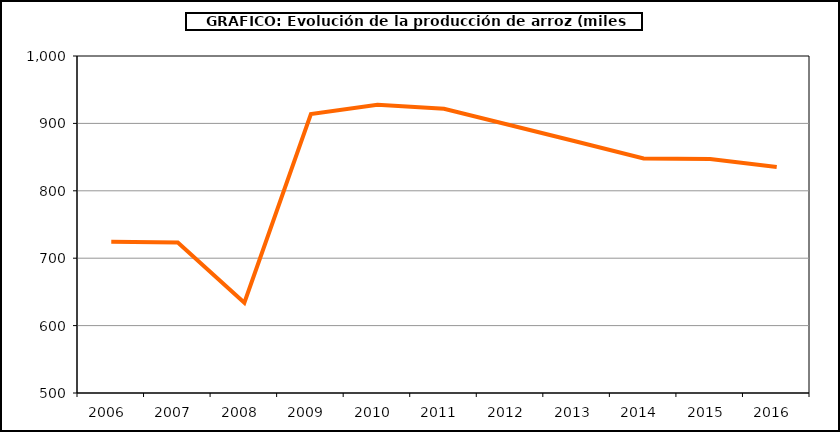
| Category | Superficie |
|---|---|
| 2006.0 | 724.351 |
| 2007.0 | 723.426 |
| 2008.0 | 633.987 |
| 2009.0 | 913.754 |
| 2010.0 | 927.817 |
| 2011.0 | 921.738 |
| 2012.0 | 897.318 |
| 2013.0 | 872.689 |
| 2014.0 | 847.976 |
| 2015.0 | 847.026 |
| 2016.0 | 835.2 |